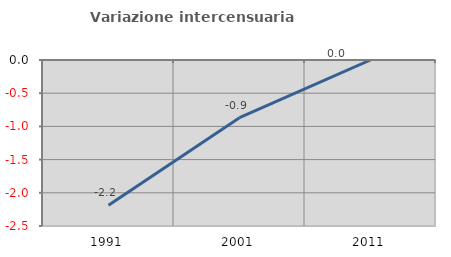
| Category | Variazione intercensuaria annua |
|---|---|
| 1991.0 | -2.189 |
| 2001.0 | -0.869 |
| 2011.0 | 0 |